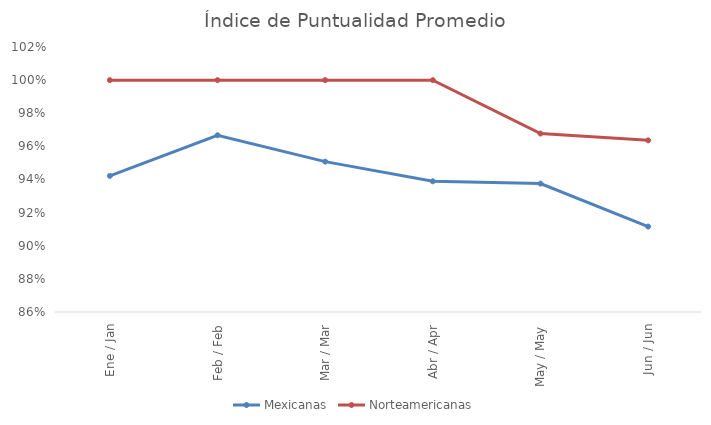
| Category | Mexicanas | Norteamericanas |
|---|---|---|
| Ene / Jan | 0.942 | 1 |
| Feb / Feb | 0.967 | 1 |
| Mar / Mar | 0.951 | 1 |
| Abr / Apr | 0.939 | 1 |
| May / May | 0.938 | 0.968 |
| Jun / Jun | 0.912 | 0.964 |